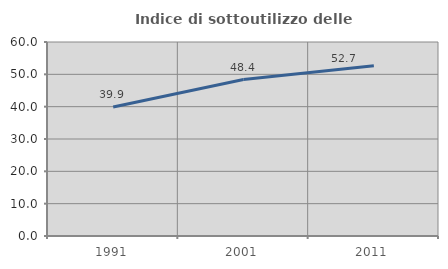
| Category | Indice di sottoutilizzo delle abitazioni  |
|---|---|
| 1991.0 | 39.901 |
| 2001.0 | 48.387 |
| 2011.0 | 52.679 |